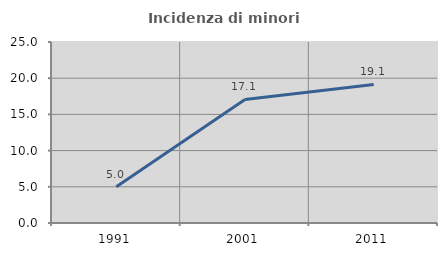
| Category | Incidenza di minori stranieri |
|---|---|
| 1991.0 | 5 |
| 2001.0 | 17.073 |
| 2011.0 | 19.134 |